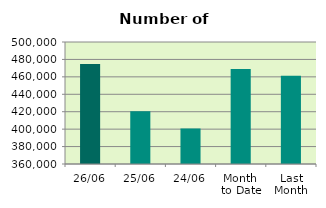
| Category | Series 0 |
|---|---|
| 26/06 | 474684 |
| 25/06 | 420472 |
| 24/06 | 400744 |
| Month 
to Date | 469139.444 |
| Last
Month | 461152.818 |